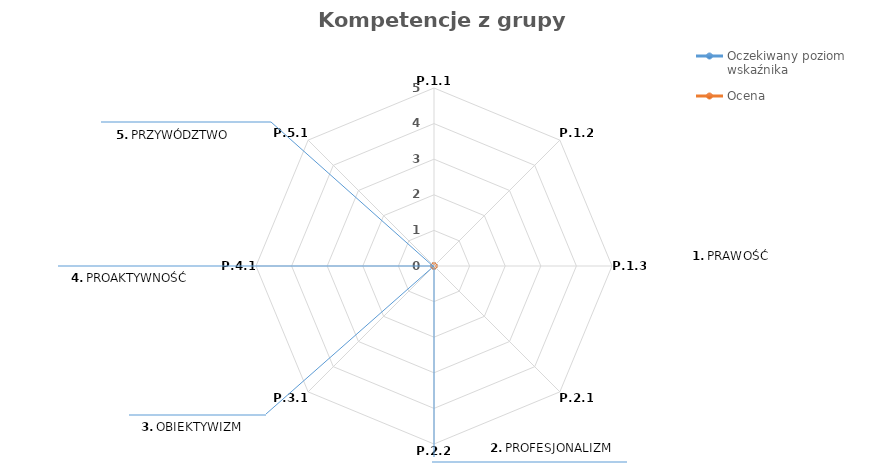
| Category | Oczekiwany poziom wskaźnika | Ocena |
|---|---|---|
| P.1.1 | 0 | 0 |
| P.1.2 | 0 | 0 |
| P.1.3 | 0 | 0 |
| P.2.1 | 0 | 0 |
| P.2.2 | 0 | 0 |
| P.3.1 | 0 | 0 |
| P.4.1 | 0 | 0 |
| P.5.1 | 0 | 0 |